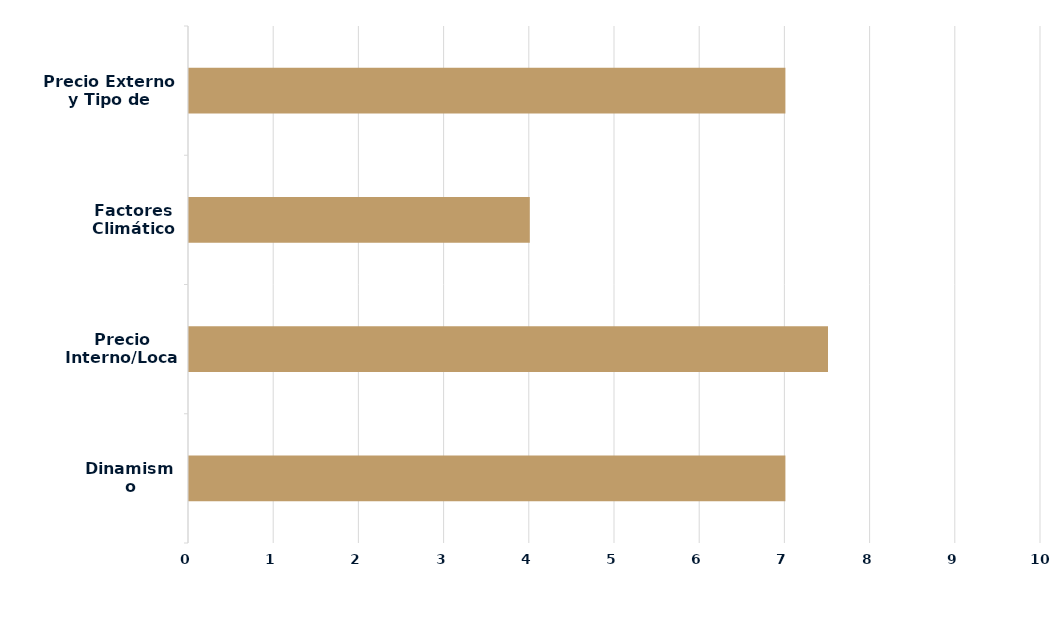
| Category | Series 0 |
|---|---|
| Dinamismo Demanda | 7 |
| Precio Interno/Local | 7.5 |
| Factores Climáticos | 4 |
| Precio Externo y Tipo de Cambio | 7 |